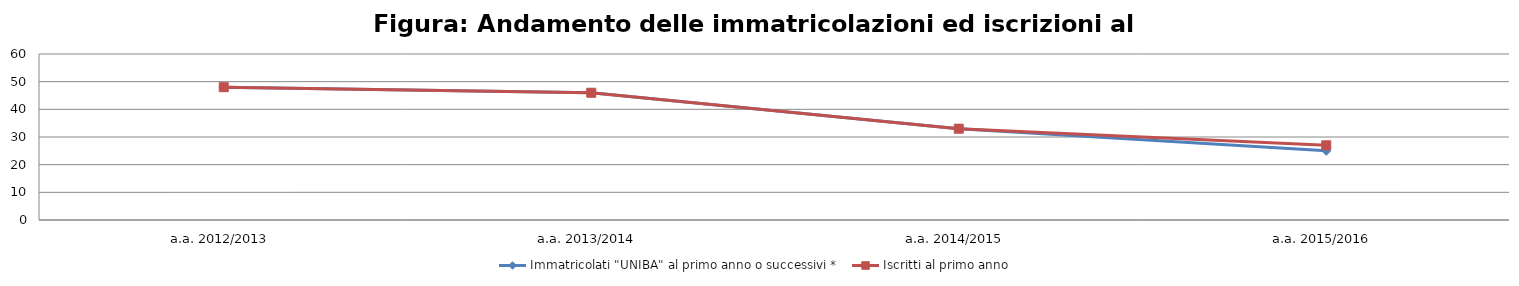
| Category | Immatricolati "UNIBA" al primo anno o successivi * | Iscritti al primo anno  |
|---|---|---|
| a.a. 2012/2013 | 48 | 48 |
| a.a. 2013/2014 | 46 | 46 |
| a.a. 2014/2015 | 33 | 33 |
| a.a. 2015/2016 | 25 | 27 |